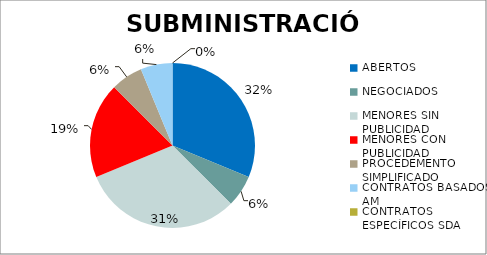
| Category | Series 0 |
|---|---|
| ABERTOS  | 0.312 |
| NEGOCIADOS  | 0.062 |
| MENORES SIN PUBLICIDAD | 0.312 |
| MENORES CON PUBLICIDAD | 0.188 |
| PROCEDEMENTO SIMPLIFICADO | 0.062 |
| CONTRATOS BASADOS AM | 0.062 |
| CONTRATOS ESPECÍFICOS SDA | 0 |